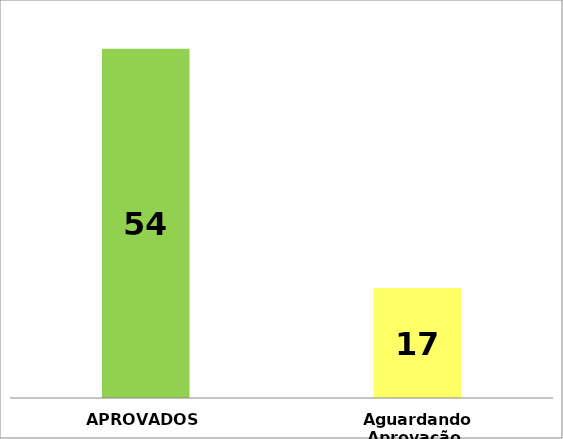
| Category | Series 0 |
|---|---|
| APROVADOS | 54 |
| Aguardando Aprovação  | 17 |